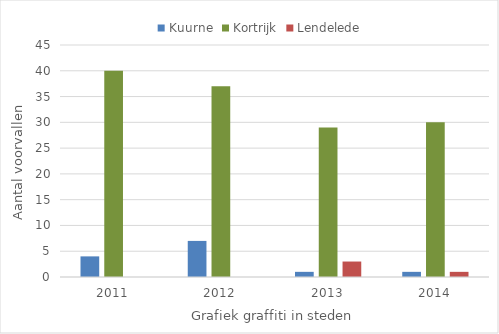
| Category | Kuurne | Kortrijk | Lendelede |
|---|---|---|---|
| 2011.0 | 4 | 40 | 0 |
| 2012.0 | 7 | 37 | 0 |
| 2013.0 | 1 | 29 | 3 |
| 2014.0 | 1 | 30 | 1 |